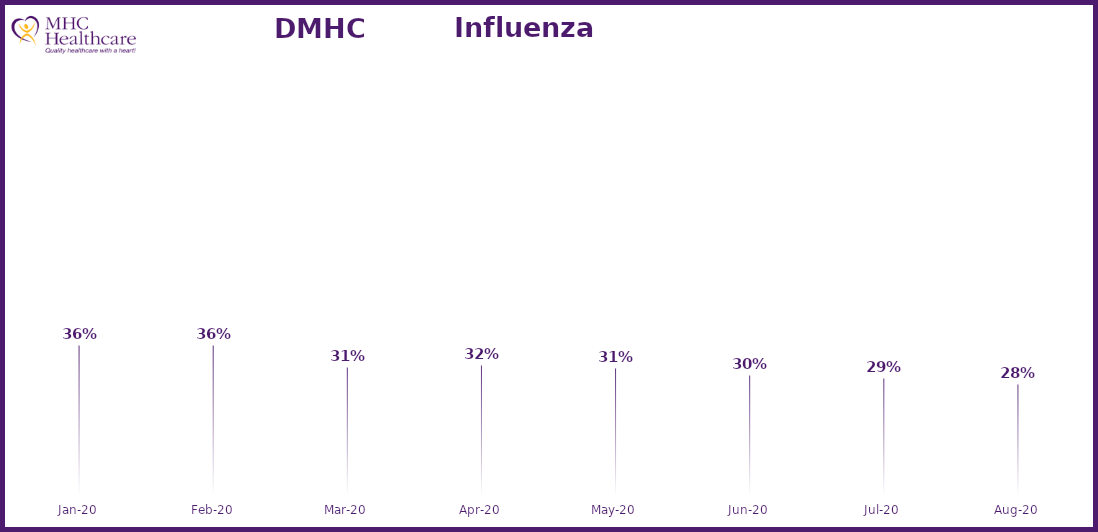
| Category | Online Access to Health Information |
|---|---|
| 2020-01-01 | 0.364 |
| 2020-02-01 | 0.364 |
| 2020-03-01 | 0.315 |
| 2020-04-01 | 0.321 |
| 2020-05-01 | 0.312 |
| 2020-06-01 | 0.296 |
| 2020-07-01 | 0.292 |
| 2020-08-01 | 0.277 |